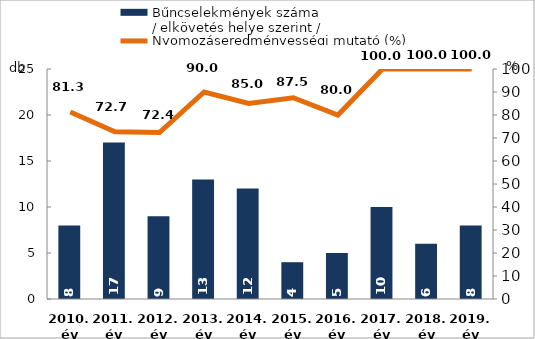
| Category | Bűncselekmények száma
/ elkövetés helye szerint / |
|---|---|
| 2010. év | 8 |
| 2011. év | 17 |
| 2012. év | 9 |
| 2013. év | 13 |
| 2014. év | 12 |
| 2015. év | 4 |
| 2016. év | 5 |
| 2017. év | 10 |
| 2018. év | 6 |
| 2019. év | 8 |